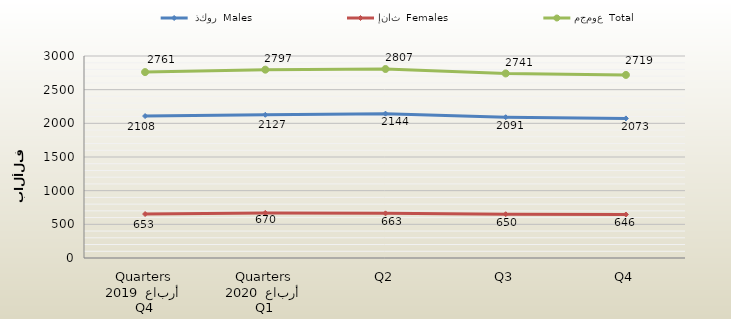
| Category |  ذكور  Males | إناث  Females | مجموع  Total |
|---|---|---|---|
| 0 | 2108 | 653 | 2761 |
| 1 | 2127 | 670 | 2797 |
| 2 | 2144 | 663 | 2807 |
| 3 | 2091 | 650 | 2741 |
| 4 | 2073 | 646 | 2719 |